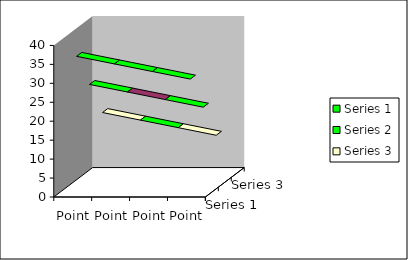
| Category | Series 1 | Series 2 | Series 3 |
|---|---|---|---|
| Point 1 | 36 | 26 | 16 |
| Point 2 | 34 | 24 | 14 |
| Point 3 | 32 | 22 | 12 |
| Point 4 | 30 | 20 | 10 |